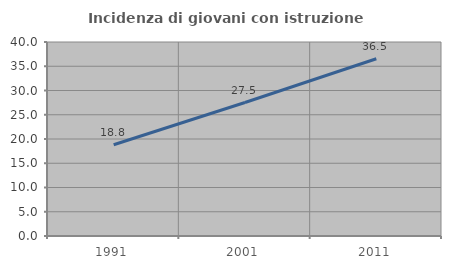
| Category | Incidenza di giovani con istruzione universitaria |
|---|---|
| 1991.0 | 18.812 |
| 2001.0 | 27.525 |
| 2011.0 | 36.548 |